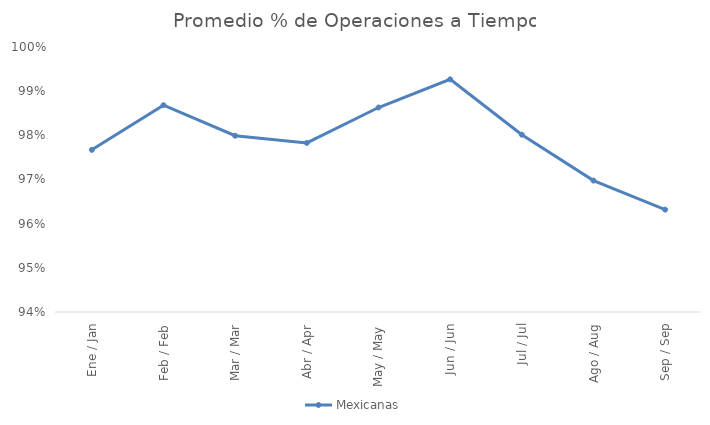
| Category | Mexicanas |
|---|---|
| Ene / Jan | 0.977 |
| Feb / Feb | 0.987 |
| Mar / Mar | 0.98 |
| Abr / Apr | 0.978 |
| May / May | 0.986 |
| Jun / Jun | 0.993 |
| Jul / Jul | 0.98 |
| Ago / Aug | 0.97 |
| Sep / Sep | 0.963 |